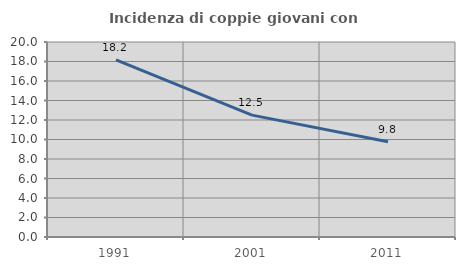
| Category | Incidenza di coppie giovani con figli |
|---|---|
| 1991.0 | 18.156 |
| 2001.0 | 12.5 |
| 2011.0 | 9.776 |